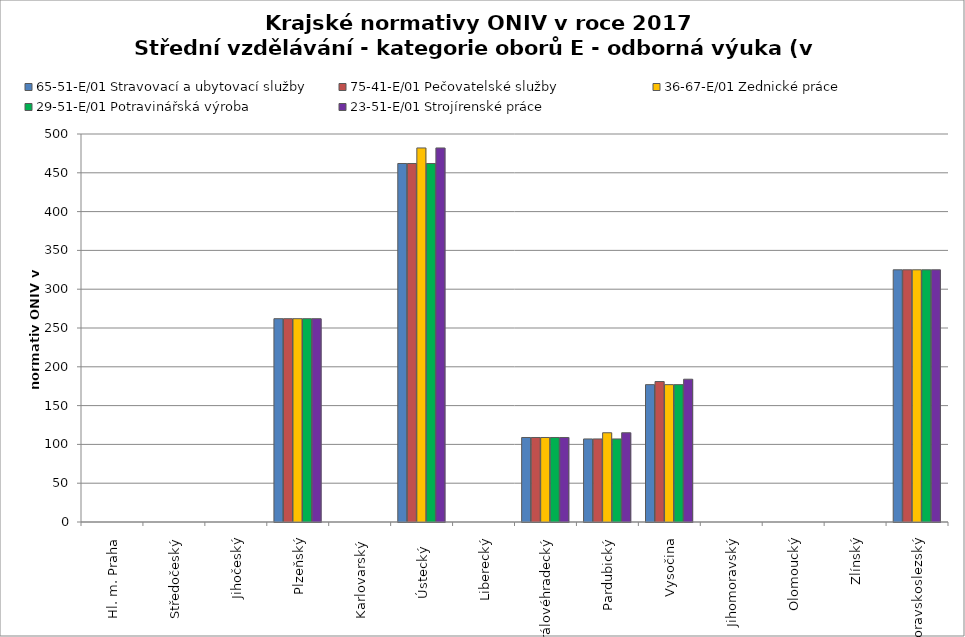
| Category | 65-51-E/01 Stravovací a ubytovací služby | 75-41-E/01 Pečovatelské služby | 36-67-E/01 Zednické práce | 29-51-E/01 Potravinářská výroba | 23-51-E/01 Strojírenské práce |
|---|---|---|---|---|---|
| Hl. m. Praha | 0 | 0 | 0 | 0 | 0 |
| Středočeský | 0 | 0 | 0 | 0 | 0 |
| Jihočeský | 0 | 0 | 0 | 0 | 0 |
| Plzeňský | 262 | 262 | 262 | 262 | 262 |
| Karlovarský  | 0 | 0 | 0 | 0 | 0 |
| Ústecký   | 462 | 462 | 482 | 462 | 482 |
| Liberecký | 0 | 0 | 0 | 0 | 0 |
| Královéhradecký | 108.9 | 108.9 | 108.9 | 108.9 | 108.9 |
| Pardubický | 107 | 107 | 115 | 107 | 115 |
| Vysočina | 177 | 181 | 177 | 177 | 184 |
| Jihomoravský | 0 | 0 | 0 | 0 | 0 |
| Olomoucký | 0 | 0 | 0 | 0 | 0 |
| Zlínský | 0 | 0 | 0 | 0 | 0 |
| Moravskoslezský | 325 | 325 | 325 | 325 | 325 |